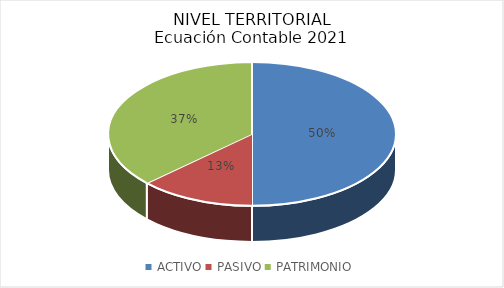
| Category | Series 0 |
|---|---|
| ACTIVO | 679946112011.169 |
| PASIVO | 177004271871.077 |
| PATRIMONIO | 502941840140.089 |